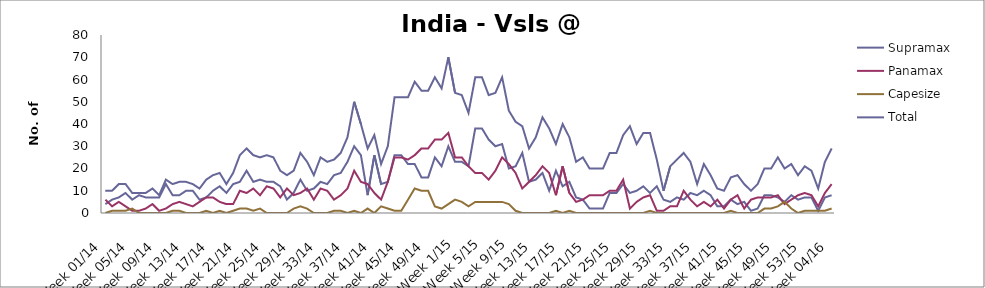
| Category | Supramax | Panamax | Capesize | Total |
|---|---|---|---|---|
| Week 01/14 | 4 | 6 | 0 | 10 |
| Week 02/14 | 6 | 3 | 1 | 10 |
| Week 03/14 | 7 | 5 | 1 | 13 |
| Week 04/14 | 9 | 3 | 1 | 13 |
| Week 05/14 | 6 | 1 | 2 | 9 |
| Week 06/14 | 8 | 1 | 0 | 9 |
| Week 07/14 | 7 | 2 | 0 | 9 |
| Week 08/14 | 7 | 4 | 0 | 11 |
| Week 09/14 | 7 | 1 | 0 | 8 |
| Week 10/14 | 13 | 2 | 0 | 15 |
| Week 11/14 | 8 | 4 | 1 | 13 |
| Week 12/14 | 8 | 5 | 1 | 14 |
| Week 13/14 | 10 | 4 | 0 | 14 |
| Week 14/14 | 10 | 3 | 0 | 13 |
| Week 15/14 | 6 | 5 | 0 | 11 |
| Week 16/14 | 7 | 7 | 1 | 15 |
| Week 17/14 | 10 | 7 | 0 | 17 |
| Week 18/14 | 12 | 5 | 1 | 18 |
| Week 19/14 | 9 | 4 | 0 | 13 |
| Week 20/14 | 13 | 4 | 1 | 18 |
| Week 21/14 | 14 | 10 | 2 | 26 |
| Week 22/14 | 19 | 9 | 2 | 29 |
| Week 23/14 | 14 | 11 | 1 | 26 |
| Week 24/14 | 15 | 8 | 2 | 25 |
| Week 25/14 | 14 | 12 | 0 | 26 |
| Week 26/14 | 14 | 11 | 0 | 25 |
| Week 27/14 | 12 | 7 | 0 | 19 |
| Week 28/14 | 6 | 11 | 0 | 17 |
| Week 29/14 | 9 | 8 | 2 | 19 |
| Week 30/14 | 15 | 9 | 3 | 27 |
| Week 31/14 | 10 | 11 | 2 | 23 |
| Week 32/14 | 11 | 6 | 0 | 17 |
| Week 33/14 | 14 | 11 | 0 | 25 |
| Week 34/14 | 13 | 10 | 0 | 23 |
| Week 35/14 | 17 | 6 | 1 | 24 |
| Week 36/14 | 18 | 8 | 1 | 27 |
| Week 37/14 | 23 | 11 | 0 | 34 |
| Week 38/14 | 30 | 19 | 1 | 50 |
| Week 39/14 | 26 | 14 | 0 | 40 |
| Week 40/14 | 8 | 13 | 2 | 29 |
| Week 41/14 | 26 | 9 | 0 | 35 |
| Week 42/14 | 13 | 6 | 3 | 22 |
| Week 43/14 | 14 | 14 | 2 | 30 |
| Week 44/14 | 26 | 25 | 1 | 52 |
| Week 45/14 | 26 | 25 | 1 | 52 |
| Week 46/14 | 22 | 24 | 6 | 52 |
| Week 47/14 | 22 | 26 | 11 | 59 |
| Week 48/14 | 16 | 29 | 10 | 55 |
| Week 49/14 | 16 | 29 | 10 | 55 |
| Week 50/14 | 25 | 33 | 3 | 61 |
| Week 51/14 | 21 | 33 | 2 | 56 |
| Week 52/14 | 30 | 36 | 4 | 70 |
| Week 1/15 | 23 | 25 | 6 | 54 |
| Week 2/15 | 23 | 25 | 5 | 53 |
| Week 3/15 | 21 | 21 | 3 | 45 |
| Week 4/15 | 38 | 18 | 5 | 61 |
| Week 5/15 | 38 | 18 | 5 | 61 |
| Week 6/15 | 33 | 15 | 5 | 53 |
| Week 7/15 | 30 | 19 | 5 | 54 |
| Week 8/15 | 31 | 25 | 5 | 61 |
| Week 9/15 | 20 | 22 | 4 | 46 |
| Week 10/15 | 21 | 18 | 1 | 41 |
| Week 11/15 | 27 | 11 | 0 | 39 |
| Week 12/15 | 14 | 14 | 0 | 29 |
| Week 13/15 | 15 | 17 | 0 | 34 |
| Week 14/15 | 18 | 21 | 0 | 43 |
| Week 15/15 | 10 | 18 | 0 | 38 |
| Week 16/15 | 19 | 8 | 1 | 31 |
| Week 17/15 | 12 | 21 | 0 | 40 |
| Week 18/15 | 14 | 9 | 1 | 34 |
| Week 19/15 | 7 | 5 | 0 | 23 |
| Week 20/15 | 6 | 6 | 0 | 25 |
| Week 21/15 | 2 | 8 | 0 | 20 |
| Week 22/15 | 2 | 8 | 0 | 20 |
| Week 23/15 | 2 | 8 | 0 | 20 |
| Week 24/15 | 9 | 10 | 0 | 27 |
| Week 25/15 | 9 | 10 | 0 | 27 |
| Week 26/15 | 13 | 15 | 0 | 35 |
| Week 27/15 | 9 | 2 | 0 | 39 |
| Week 28/15 | 10 | 5 | 0 | 31 |
| Week 29/15 | 12 | 7 | 0 | 36 |
| Week 30/15 | 9 | 8 | 1 | 36 |
| Week 31/15 | 12 | 1 | 0 | 24 |
| Week 32/15 | 6 | 1 | 0 | 10 |
| Week 33/15 | 5 | 3 | 0 | 21 |
| Week 34/15 | 7 | 3 | 0 | 24 |
| Week 35/15 | 6 | 10 | 0 | 27 |
| Week 36/15 | 9 | 6 | 0 | 23 |
| Week 37/15 | 8 | 3 | 0 | 13 |
| Week 38/15 | 10 | 5 | 0 | 22 |
| Week 39/15 | 8 | 3 | 0 | 17 |
| Week 40/15 | 3 | 6 | 0 | 11 |
| Week 41/15 | 3 | 2 | 0 | 10 |
| Week 42/15 | 6 | 6 | 1 | 16 |
| Week 43/15 | 4 | 8 | 0 | 17 |
| Week 44/15 | 5 | 2 | 0 | 13 |
| Week 45/15 | 1 | 6 | 0 | 10 |
| Week 46/15 | 2 | 7 | 0 | 13 |
| Week 47/15 | 8 | 7 | 2 | 20 |
| Week 48/15 | 8 | 7 | 2 | 20 |
| Week 49/15 | 7 | 8 | 3 | 25 |
| Week 50/15 | 5 | 4 | 5 | 20 |
| Week 51/15 | 8 | 6 | 2 | 22 |
| Week 52/15 | 6 | 8 | 0 | 17 |
| Week 53/15 | 7 | 9 | 1 | 21 |
| Week 01/16 | 7 | 8 | 1 | 19 |
| Week 02/16 | 1 | 3 | 1 | 11 |
| Week 03/16 | 7 | 9 | 1 | 23 |
| Week 04/16 | 8 | 13 | 2 | 29 |